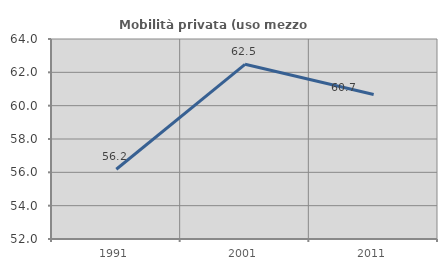
| Category | Mobilità privata (uso mezzo privato) |
|---|---|
| 1991.0 | 56.185 |
| 2001.0 | 62.482 |
| 2011.0 | 60.673 |